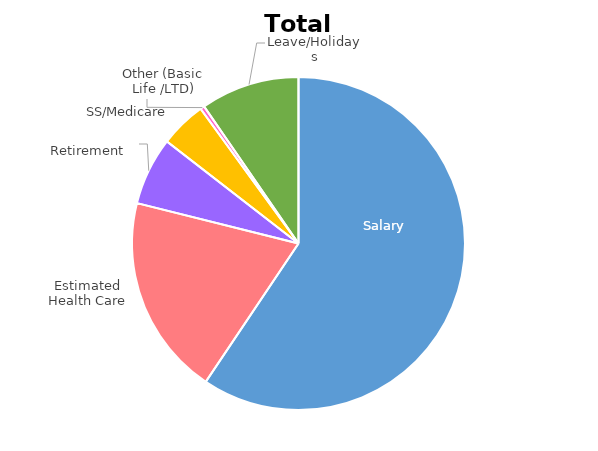
| Category | Series 0 |
|---|---|
| Salary | 0.594 |
| Estimated Health Care | 0.195 |
| Retirement | 0.066 |
| SS/Medicare | 0.045 |
| Other (Basic Life /LTD) | 0.004 |
| Leave/Holidays | 0.096 |